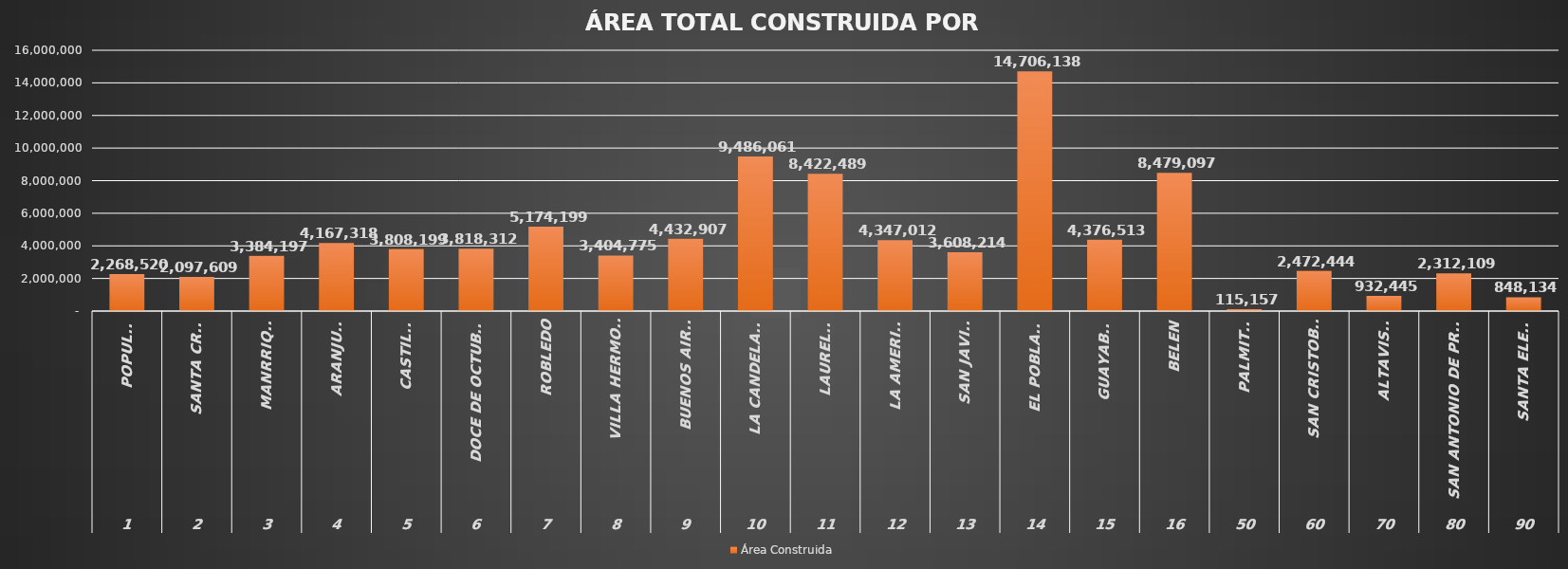
| Category | Área Construida |
|---|---|
| 0 | 2268520.41 |
| 1 | 2097609.09 |
| 2 | 3384196.68 |
| 3 | 4167317.91 |
| 4 | 3808198.68 |
| 5 | 3818312.49 |
| 6 | 5174199.09 |
| 7 | 3404774.58 |
| 8 | 4432906.86 |
| 9 | 9486060.74 |
| 10 | 8422488.65 |
| 11 | 4347011.82 |
| 12 | 3608213.72 |
| 13 | 14706137.99 |
| 14 | 4376513.09 |
| 15 | 8479097.34 |
| 16 | 115157.02 |
| 17 | 2472444.13 |
| 18 | 932444.53 |
| 19 | 2312109.01 |
| 20 | 848133.67 |